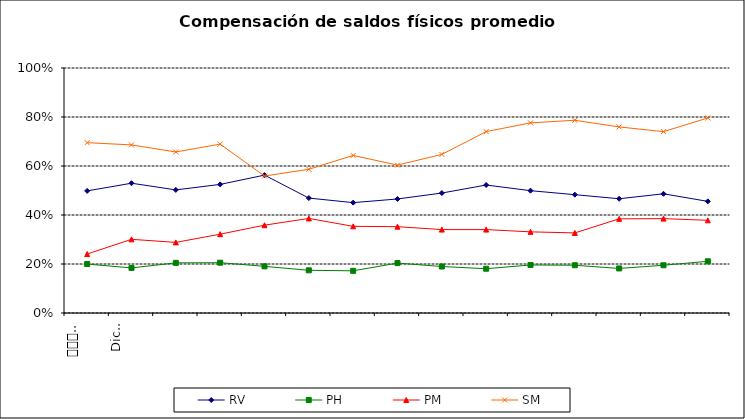
| Category | RV | PH | PM | SM |
|---|---|---|---|---|
| 0 | 0.498 | 0.2 | 0.241 | 0.695 |
| 1 | 0.53 | 0.184 | 0.301 | 0.686 |
| 2 | 0.502 | 0.205 | 0.288 | 0.657 |
| 3 | 0.525 | 0.205 | 0.322 | 0.689 |
| 4 | 0.563 | 0.19 | 0.358 | 0.559 |
| 5 | 0.469 | 0.174 | 0.386 | 0.587 |
| 6 | 0.45 | 0.172 | 0.354 | 0.643 |
| 7 | 0.465 | 0.204 | 0.352 | 0.604 |
| 8 | 0.49 | 0.19 | 0.34 | 0.647 |
| 9 | 0.522 | 0.181 | 0.34 | 0.74 |
| 10 | 0.499 | 0.196 | 0.331 | 0.776 |
| 11 | 0.483 | 0.195 | 0.327 | 0.787 |
| 12 | 0.466 | 0.182 | 0.384 | 0.759 |
| 13 | 0.486 | 0.195 | 0.385 | 0.74 |
| 14 | 0.456 | 0.211 | 0.378 | 0.796 |